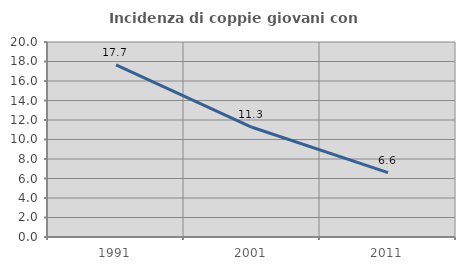
| Category | Incidenza di coppie giovani con figli |
|---|---|
| 1991.0 | 17.665 |
| 2001.0 | 11.254 |
| 2011.0 | 6.604 |